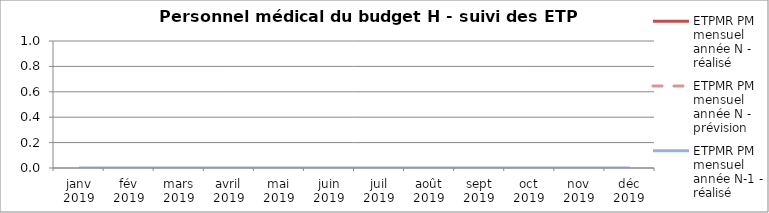
| Category | ETPMR PM mensuel année N - réalisé | ETPMR PM mensuel année N - prévision | ETPMR PM mensuel année N-1 - réalisé |
|---|---|---|---|
| janv 2019 |  |  | 0 |
| fév 2019 |  |  | 0 |
| mars 2019 |  |  | 0 |
| avril 2019 |  |  | 0 |
| mai 2019 |  |  | 0 |
| juin 2019 |  |  | 0 |
| juil 2019 |  |  | 0 |
| août 2019 |  |  | 0 |
| sept 2019 |  |  | 0 |
| oct 2019 |  |  | 0 |
| nov 2019 |  |  | 0 |
| déc 2019 |  |  | 0 |